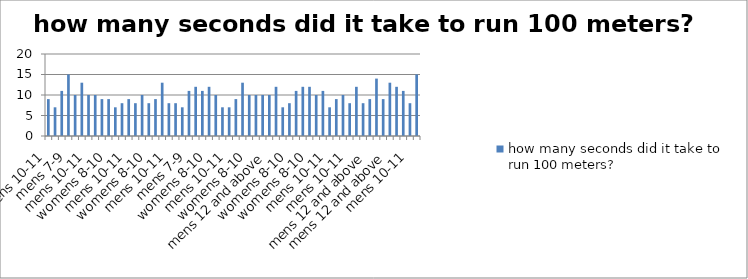
| Category | how many seconds did it take to run 100 meters? |
|---|---|
| mens 10-11 | 9 |
| mens 10-11 | 7 |
| womens 5-7 | 11 |
| mens 7-9 | 15 |
| womens 8-10 | 10 |
| womens 8-10 | 13 |
| mens 10-11 | 10 |
| womens 8-10 | 10 |
| womens 8-10 | 9 |
| womens 8-10 | 9 |
| womens 5-7 | 7 |
| mens 12 and above | 8 |
| mens 10-11 | 9 |
| mens 10-11 | 8 |
| womens 5-7 | 10 |
| womens 8-10 | 8 |
| mens 10-11 | 9 |
| womens 8-10 | 13 |
| mens 10-11 | 8 |
| mens 12 and above | 8 |
| mens 10-11 | 7 |
| mens 7-9 | 11 |
| womens 5-7 | 12 |
| womens 8-10 | 11 |
| womens 8-10 | 12 |
| womens 5-7 | 10 |
| mens 10-11 | 7 |
| mens 10-11 | 7 |
| womens 8-10 | 9 |
| mens 10-11 | 13 |
| womens 8-10 | 10 |
| womens 8-10 | 10 |
| mens 10-11 | 10 |
| mens 12 and above | 10 |
| womens 8-10 | 12 |
| mens 10-11 | 7 |
| womens 8-10 | 8 |
| womens 5-7 | 11 |
| mens 7-9 | 12 |
| womens 8-10 | 12 |
| mens 7-9 | 10 |
| womens 11 and above | 11 |
| mens 10-11 | 7 |
| mens 7-9 | 9 |
| mens 7-9 | 10 |
| mens 10-11 | 8 |
| womens 8-10 | 12 |
| mens 10-11 | 8 |
| mens 12 and above | 9 |
| womens 8-10 | 14 |
| mens 12 and above | 9 |
| mens 12 and above | 13 |
| womens 8-10 | 12 |
| womens 8-10 | 11 |
| mens 10-11 | 8 |
| womens 11 and above | 15 |